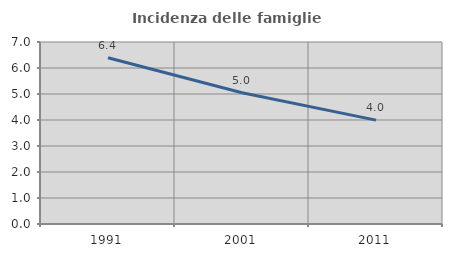
| Category | Incidenza delle famiglie numerose |
|---|---|
| 1991.0 | 6.394 |
| 2001.0 | 5.048 |
| 2011.0 | 3.995 |